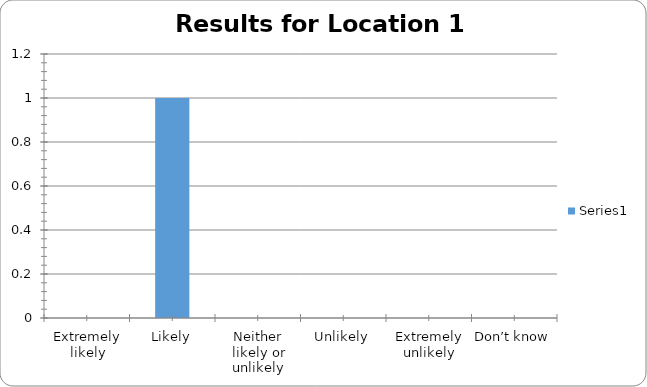
| Category | Series 0 |
|---|---|
| Extremely likely | 0 |
| Likely | 1 |
| Neither likely or unlikely | 0 |
| Unlikely | 0 |
| Extremely unlikely | 0 |
| Don’t know | 0 |